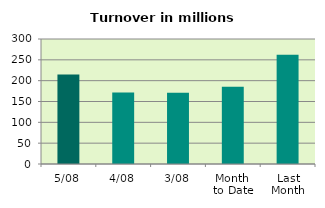
| Category | Series 0 |
|---|---|
| 5/08 | 214.909 |
| 4/08 | 171.89 |
| 3/08 | 170.96 |
| Month 
to Date | 185.112 |
| Last
Month | 262.308 |